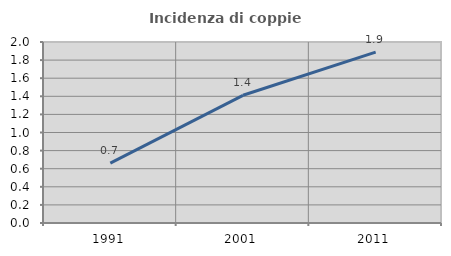
| Category | Incidenza di coppie miste |
|---|---|
| 1991.0 | 0.661 |
| 2001.0 | 1.411 |
| 2011.0 | 1.889 |